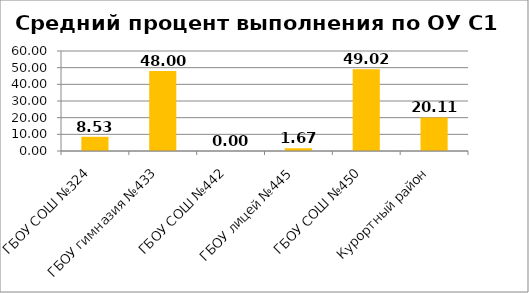
| Category | C1 |
|---|---|
| ГБОУ СОШ №324 | 8.527 |
| ГБОУ гимназия №433 | 48 |
| ГБОУ СОШ №442 | 0 |
| ГБОУ лицей №445 | 1.667 |
| ГБОУ СОШ №450 | 49.02 |
| Курортный район | 20.11 |